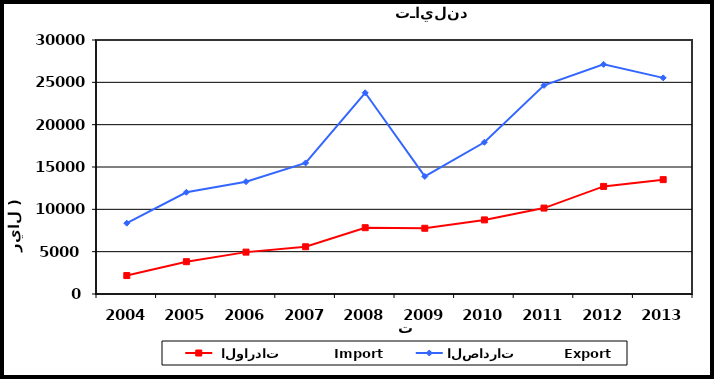
| Category |  الواردات           Import | الصادرات          Export |
|---|---|---|
| 2004.0 | 2179 | 8365 |
| 2005.0 | 3817 | 12016 |
| 2006.0 | 4946 | 13264 |
| 2007.0 | 5582 | 15480 |
| 2008.0 | 7832 | 23765 |
| 2009.0 | 7764 | 13884 |
| 2010.0 | 8753 | 17924 |
| 2011.0 | 10149 | 24641 |
| 2012.0 | 12707 | 27123 |
| 2013.0 | 13508 | 25528 |